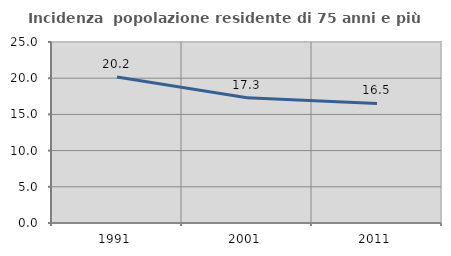
| Category | Incidenza  popolazione residente di 75 anni e più |
|---|---|
| 1991.0 | 20.157 |
| 2001.0 | 17.286 |
| 2011.0 | 16.514 |